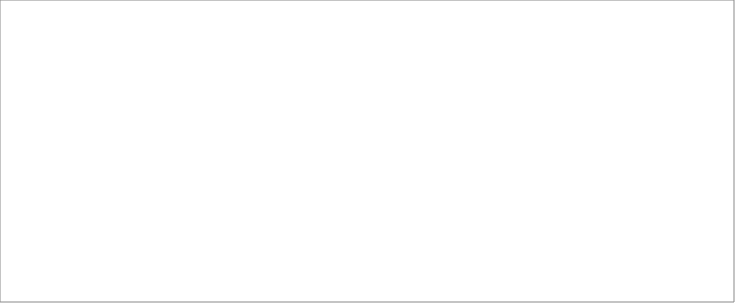
| Category | Prospecting | Qualification | Needs Analysis | Value Proposition | Decision Makers | Perception Analysis | Proposal/Price Quote | Negotiation/Review |
|---|---|---|---|---|---|---|---|---|
| Option1 | 200 | 201 | 800 | 135 | 250 | 36 | 40 | 600 |
| Option2 | 50 | 60 | 1000 | 600 | 300 | 20 | 300 | 1500 |